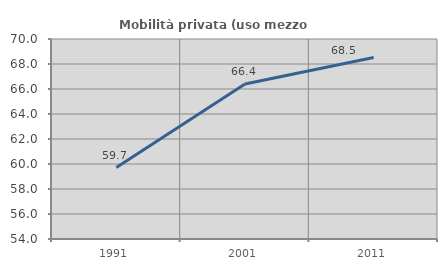
| Category | Mobilità privata (uso mezzo privato) |
|---|---|
| 1991.0 | 59.716 |
| 2001.0 | 66.395 |
| 2011.0 | 68.523 |